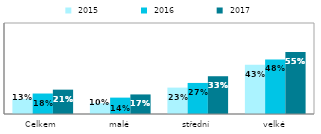
| Category |  2015 |  2016 |  2017 |
|---|---|---|---|
| Celkem | 0.133 | 0.18 | 0.214 |
| malé | 0.095 | 0.144 | 0.172 |
| střední | 0.232 | 0.273 | 0.332 |
| velké | 0.432 | 0.48 | 0.545 |